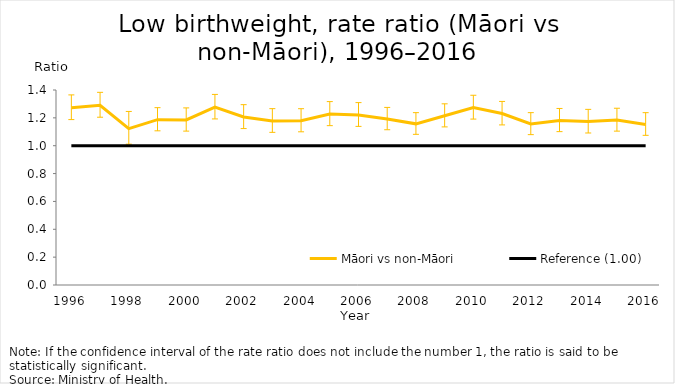
| Category | Māori vs non-Māori | Reference (1.00) |
|---|---|---|
| 1996.0 | 1.273 | 1 |
| 1997.0 | 1.291 | 1 |
| 1998.0 | 1.122 | 1 |
| 1999.0 | 1.187 | 1 |
| 2000.0 | 1.185 | 1 |
| 2001.0 | 1.277 | 1 |
| 2002.0 | 1.206 | 1 |
| 2003.0 | 1.178 | 1 |
| 2004.0 | 1.18 | 1 |
| 2005.0 | 1.227 | 1 |
| 2006.0 | 1.221 | 1 |
| 2007.0 | 1.192 | 1 |
| 2008.0 | 1.157 | 1 |
| 2009.0 | 1.215 | 1 |
| 2010.0 | 1.274 | 1 |
| 2011.0 | 1.231 | 1 |
| 2012.0 | 1.156 | 1 |
| 2013.0 | 1.181 | 1 |
| 2014.0 | 1.173 | 1 |
| 2015.0 | 1.184 | 1 |
| 2016.0 | 1.153 | 1 |